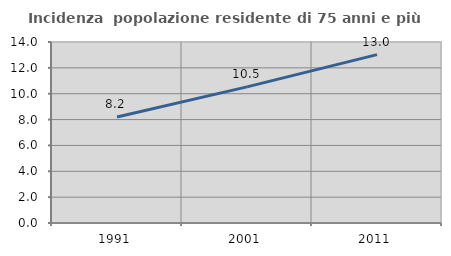
| Category | Incidenza  popolazione residente di 75 anni e più |
|---|---|
| 1991.0 | 8.198 |
| 2001.0 | 10.528 |
| 2011.0 | 13.026 |